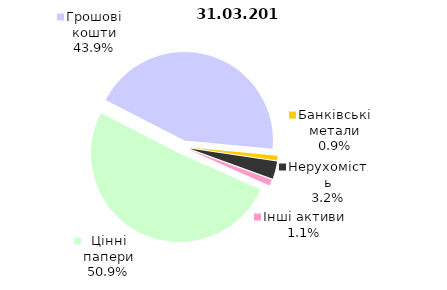
| Category | Всього |
|---|---|
| Цінні папери | 557883182.01 |
| Грошові кошти | 481901757.752 |
| Банківські метали | 9455127.05 |
| Нерухомість | 35102847.64 |
| Інші активи | 12237929.16 |